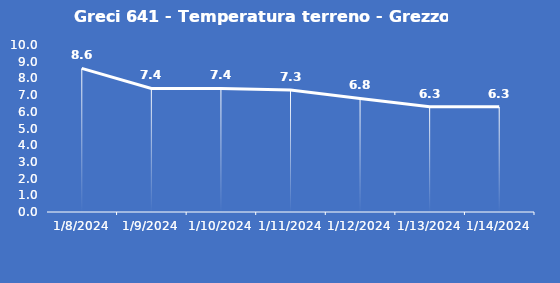
| Category | Greci 641 - Temperatura terreno - Grezzo (°C) |
|---|---|
| 1/8/24 | 8.6 |
| 1/9/24 | 7.4 |
| 1/10/24 | 7.4 |
| 1/11/24 | 7.3 |
| 1/12/24 | 6.8 |
| 1/13/24 | 6.3 |
| 1/14/24 | 6.3 |